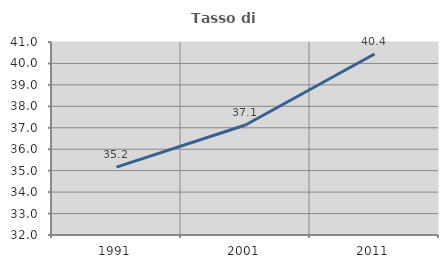
| Category | Tasso di occupazione   |
|---|---|
| 1991.0 | 35.165 |
| 2001.0 | 37.131 |
| 2011.0 | 40.442 |